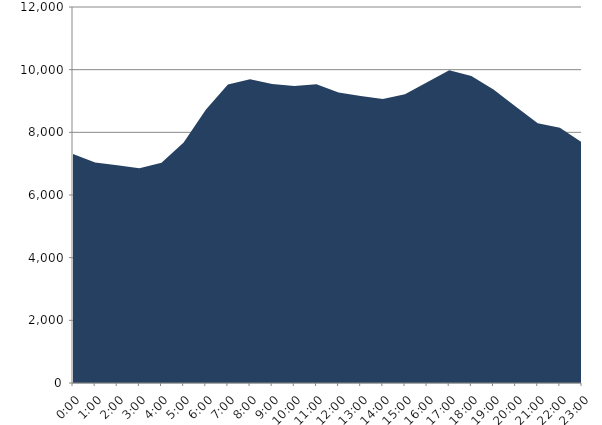
| Category | Series 0 | Series 1 |
|---|---|---|
| 2020-11-18 |  | 7309.059 |
| 2020-11-18 01:00:00 |  | 7038.237 |
| 2020-11-18 02:00:00 |  | 6952.43 |
| 2020-11-18 03:00:00 |  | 6855.182 |
| 2020-11-18 04:00:00 |  | 7031.296 |
| 2020-11-18 05:00:00 |  | 7676.882 |
| 2020-11-18 06:00:00 |  | 8717.788 |
| 2020-11-18 07:00:00 |  | 9526.232 |
| 2020-11-18 08:00:00 |  | 9696.228 |
| 2020-11-18 09:00:00 |  | 9539.53 |
| 2020-11-18 10:00:00 |  | 9479.559 |
| 2020-11-18 11:00:00 |  | 9534.774 |
| 2020-11-18 12:00:00 |  | 9274.919 |
| 2020-11-18 13:00:00 |  | 9158.284 |
| 2020-11-18 14:00:00 |  | 9063.271 |
| 2020-11-18 15:00:00 |  | 9217.115 |
| 2020-11-18 16:00:00 |  | 9595.687 |
| 2020-11-18 17:00:00 |  | 9983.019 |
| 2020-11-18 18:00:00 |  | 9798.439 |
| 2020-11-18 19:00:00 |  | 9367.474 |
| 2020-11-18 20:00:00 |  | 8827.475 |
| 2020-11-18 21:00:00 |  | 8293.559 |
| 2020-11-18 22:00:00 |  | 8148.721 |
| 2020-11-18 23:00:00 |  | 7675.507 |